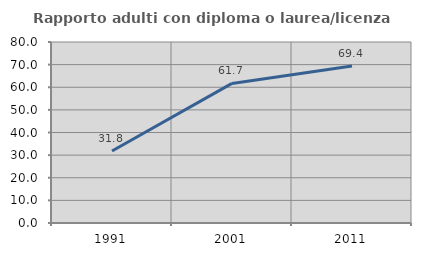
| Category | Rapporto adulti con diploma o laurea/licenza media  |
|---|---|
| 1991.0 | 31.818 |
| 2001.0 | 61.702 |
| 2011.0 | 69.427 |